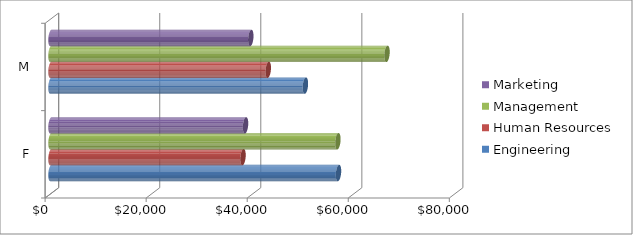
| Category | Engineering | Human Resources | Management | Marketing |
|---|---|---|---|---|
| F | 56900 | 38000 | 56775 | 38500 |
| M | 50348.571 | 43000 | 66500 | 39540 |